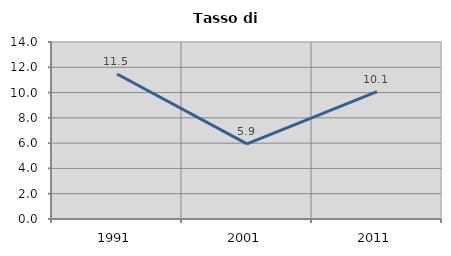
| Category | Tasso di disoccupazione   |
|---|---|
| 1991.0 | 11.47 |
| 2001.0 | 5.944 |
| 2011.0 | 10.075 |